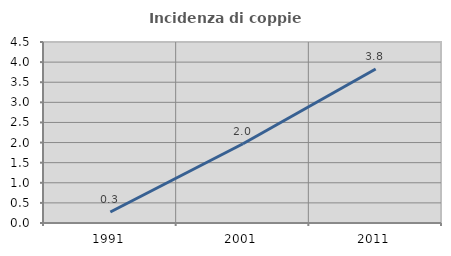
| Category | Incidenza di coppie miste |
|---|---|
| 1991.0 | 0.272 |
| 2001.0 | 1.971 |
| 2011.0 | 3.829 |